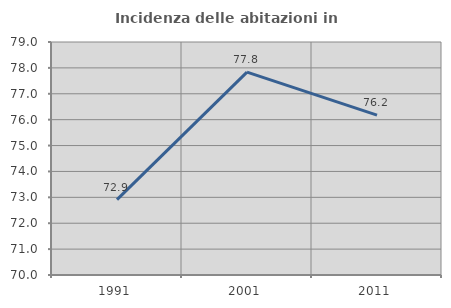
| Category | Incidenza delle abitazioni in proprietà  |
|---|---|
| 1991.0 | 72.909 |
| 2001.0 | 77.837 |
| 2011.0 | 76.177 |